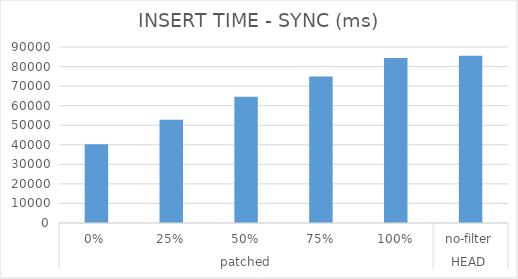
| Category | Series 0 |
|---|---|
| 0 | 40253.978 |
| 1 | 52814.942 |
| 2 | 64616.457 |
| 3 | 74963.559 |
| 4 | 84350.859 |
| 5 | 85516.25 |